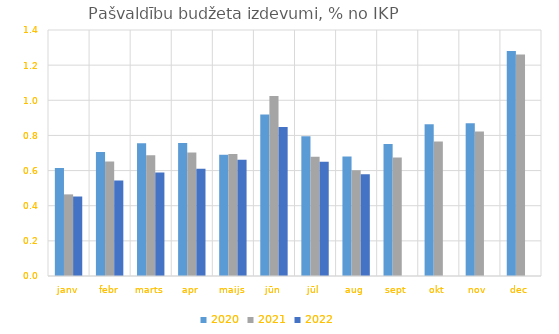
| Category | 2020 | 2021 | 2022 |
|---|---|---|---|
| janv | 0.614 | 0.465 | 0.452 |
| febr | 0.706 | 0.651 | 0.544 |
| marts | 0.756 | 0.686 | 0.59 |
| apr | 0.758 | 0.703 | 0.61 |
| maijs | 0.69 | 0.694 | 0.662 |
| jūn | 0.919 | 1.024 | 0.848 |
| jūl | 0.795 | 0.679 | 0.651 |
| aug | 0.68 | 0.602 | 0.579 |
| sept | 0.751 | 0.675 | 0 |
| okt | 0.864 | 0.766 | 0 |
| nov | 0.87 | 0.822 | 0 |
| dec | 1.281 | 1.26 | 0 |